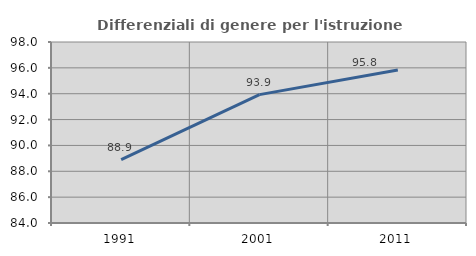
| Category | Differenziali di genere per l'istruzione superiore |
|---|---|
| 1991.0 | 88.9 |
| 2001.0 | 93.931 |
| 2011.0 | 95.84 |